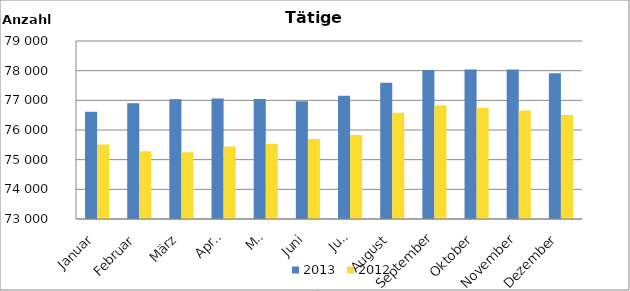
| Category | 2013 | 2012 |
|---|---|---|
| Januar | 76616 | 75514 |
| Februar | 76899 | 75285 |
| März | 77034 | 75247 |
| April | 77063 | 75448 |
| Mai | 77044 | 75536 |
| Juni | 76973 | 75694 |
| Juli | 77155 | 75828 |
| August | 77596 | 76578 |
| September | 78021 | 76838 |
| Oktober | 78037 | 76752 |
| November | 78043 | 76657 |
| Dezember | 77917 | 76506 |